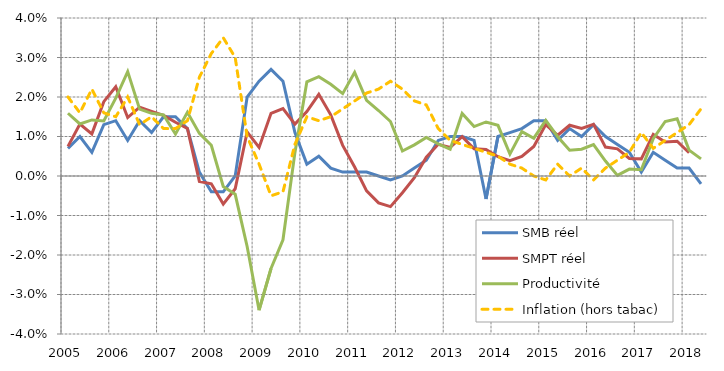
| Category | SMB réel | SMPT réel | Productivité | Inflation (hors tabac) |
|---|---|---|---|---|
| 2005.0 | 0.007 | 0.007 | 0.016 | 0.02 |
| nan | 0.01 | 0.013 | 0.013 | 0.016 |
| nan | 0.006 | 0.011 | 0.014 | 0.022 |
| nan | 0.013 | 0.019 | 0.014 | 0.016 |
| 2006.0 | 0.014 | 0.023 | 0.02 | 0.015 |
| nan | 0.009 | 0.015 | 0.026 | 0.02 |
| nan | 0.014 | 0.017 | 0.017 | 0.013 |
| nan | 0.011 | 0.016 | 0.016 | 0.015 |
| 2007.0 | 0.015 | 0.015 | 0.015 | 0.012 |
| nan | 0.015 | 0.014 | 0.011 | 0.012 |
| nan | 0.012 | 0.012 | 0.016 | 0.014 |
| nan | 0.001 | -0.001 | 0.011 | 0.025 |
| 2008.0 | -0.004 | -0.002 | 0.008 | 0.031 |
| nan | -0.004 | -0.007 | -0.003 | 0.035 |
| nan | 0 | -0.003 | -0.005 | 0.03 |
| nan | 0.02 | 0.011 | -0.018 | 0.01 |
| 2009.0 | 0.024 | 0.007 | -0.034 | 0.003 |
| nan | 0.027 | 0.016 | -0.023 | -0.005 |
| nan | 0.024 | 0.017 | -0.016 | -0.004 |
| nan | 0.011 | 0.013 | 0.006 | 0.008 |
| 2010.0 | 0.003 | 0.016 | 0.024 | 0.015 |
| nan | 0.005 | 0.021 | 0.025 | 0.014 |
| nan | 0.002 | 0.015 | 0.023 | 0.015 |
| nan | 0.001 | 0.008 | 0.021 | 0.017 |
| 2011.0 | 0.001 | 0.002 | 0.026 | 0.019 |
| nan | 0.001 | -0.004 | 0.019 | 0.021 |
| nan | 0 | -0.007 | 0.017 | 0.022 |
| nan | -0.001 | -0.008 | 0.014 | 0.024 |
| 2012.0 | 0 | -0.004 | 0.006 | 0.022 |
| nan | 0.002 | 0 | 0.008 | 0.019 |
| nan | 0.004 | 0.005 | 0.01 | 0.018 |
| nan | 0.009 | 0.008 | 0.008 | 0.012 |
| 2013.0 | 0.01 | 0.007 | 0.007 | 0.009 |
| nan | 0.01 | 0.01 | 0.016 | 0.008 |
| nan | 0.009 | 0.007 | 0.013 | 0.007 |
| nan | -0.006 | 0.007 | 0.014 | 0.006 |
| 2014.0 | 0.01 | 0.005 | 0.013 | 0.005 |
| nan | 0.011 | 0.004 | 0.006 | 0.003 |
| nan | 0.012 | 0.005 | 0.011 | 0.002 |
| nan | 0.014 | 0.007 | 0.01 | 0 |
| 2015.0 | 0.014 | 0.013 | 0.014 | -0.001 |
| nan | 0.009 | 0.01 | 0.01 | 0.003 |
| nan | 0.012 | 0.013 | 0.007 | 0 |
| nan | 0.01 | 0.012 | 0.007 | 0.002 |
| 2016.0 | 0.013 | 0.013 | 0.008 | -0.001 |
| nan | 0.01 | 0.007 | 0.004 | 0.002 |
| nan | 0.008 | 0.007 | 0 | 0.004 |
| nan | 0.006 | 0.004 | 0.002 | 0.006 |
| 2017.0 | 0.001 | 0.004 | 0.002 | 0.011 |
| nan | 0.006 | 0.011 | 0.009 | 0.007 |
| nan | 0.004 | 0.009 | 0.014 | 0.009 |
| nan | 0.002 | 0.009 | 0.015 | 0.011 |
| 2018.0 | 0.002 | 0.006 | 0.007 | 0.013 |